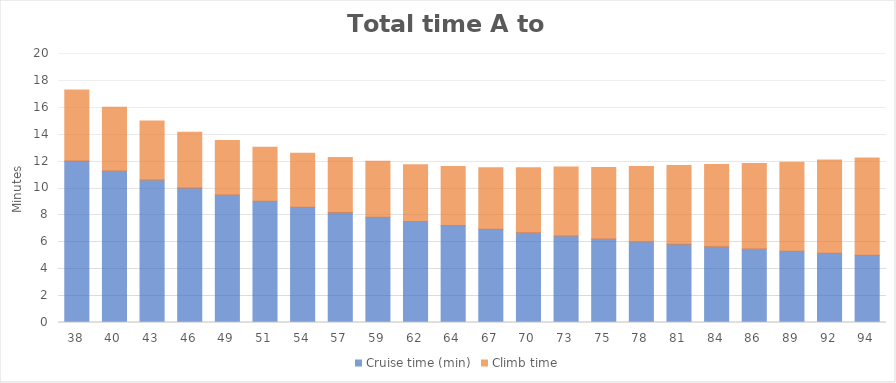
| Category | Cruise time (min) | Climb time |
|---|---|---|
| 38 | 12.008 | 5.287 |
| 40 | 11.257 | 4.738 |
| 43 | 10.595 | 4.391 |
| 46 | 10.006 | 4.147 |
| 49 | 9.48 | 4.051 |
| 51 | 9.006 | 4.024 |
| 54 | 8.577 | 3.999 |
| 57 | 8.187 | 4.082 |
| 59 | 7.831 | 4.158 |
| 62 | 7.505 | 4.228 |
| 64 | 7.205 | 4.385 |
| 67 | 6.928 | 4.575 |
| 70 | 6.671 | 4.838 |
| 73 | 6.433 | 5.123 |
| 75 | 6.211 | 5.309 |
| 78 | 6.004 | 5.598 |
| 81 | 5.81 | 5.869 |
| 84 | 5.629 | 6.123 |
| 86 | 5.458 | 6.362 |
| 89 | 5.298 | 6.62 |
| 92 | 5.146 | 6.931 |
| 94 | 5.003 | 7.225 |